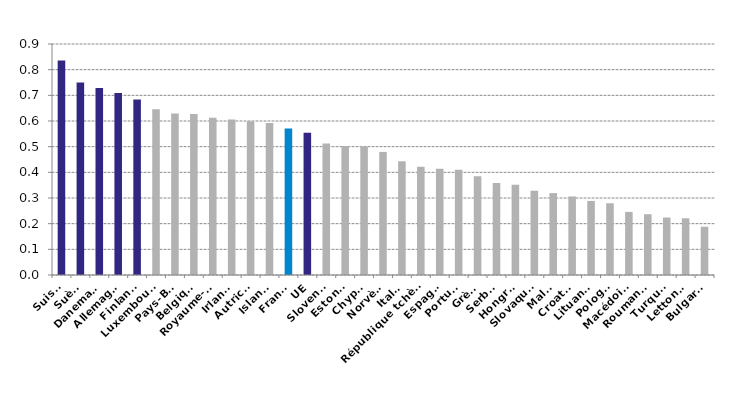
| Category | Series 0 |
|---|---|
| Suisse | 0.835 |
| Suède | 0.75 |
| Danemark | 0.728 |
| Allemagne | 0.709 |
| Finlande | 0.684 |
| Luxembourg | 0.646 |
| Pays-Bas | 0.629 |
| Belgique | 0.627 |
| Royaume-Uni | 0.613 |
| Irlande | 0.606 |
| Autriche | 0.599 |
| Islande | 0.593 |
| France | 0.571 |
| UE | 0.554 |
| Slovenie | 0.513 |
| Estonie | 0.502 |
| Chypre | 0.501 |
| Norvège | 0.48 |
| Italie | 0.443 |
| République tchèque | 0.422 |
| Espagne | 0.414 |
| Portugal | 0.41 |
| Grèce | 0.384 |
| Serbie | 0.358 |
| Hongrie | 0.351 |
| Slovaquie | 0.328 |
| Malte | 0.319 |
| Croatie | 0.306 |
| Lituanie | 0.289 |
| Pologne | 0.279 |
| Macédoine | 0.246 |
| Roumanie | 0.237 |
| Turquie | 0.224 |
| Lettonie | 0.221 |
| Bulgarie | 0.188 |